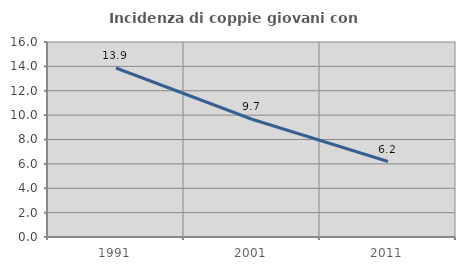
| Category | Incidenza di coppie giovani con figli |
|---|---|
| 1991.0 | 13.867 |
| 2001.0 | 9.662 |
| 2011.0 | 6.19 |